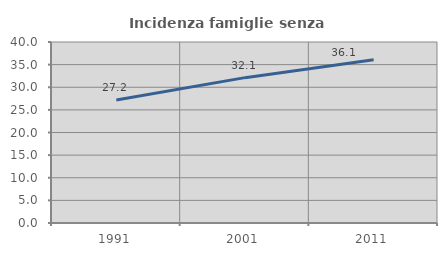
| Category | Incidenza famiglie senza nuclei |
|---|---|
| 1991.0 | 27.197 |
| 2001.0 | 32.123 |
| 2011.0 | 36.054 |